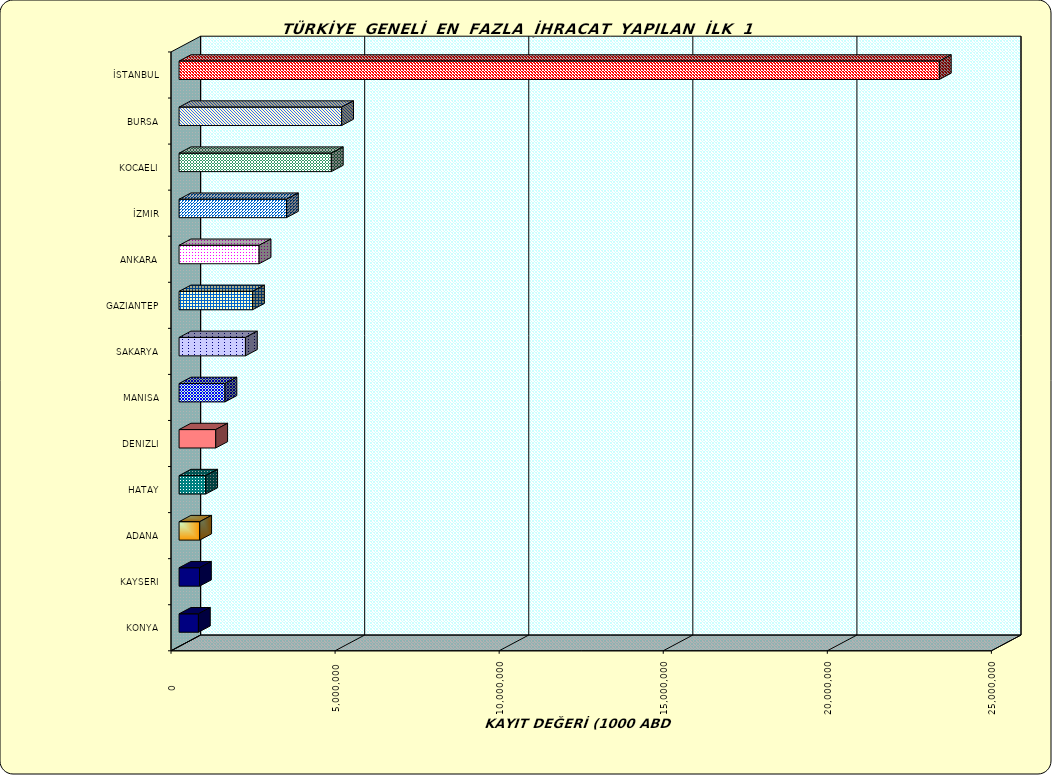
| Category | Series 0 |
|---|---|
| İSTANBUL | 23168135.897 |
| BURSA | 4953978.629 |
| KOCAELI | 4640013.752 |
| İZMIR | 3272809.37 |
| ANKARA | 2439005.863 |
| GAZIANTEP | 2238660.662 |
| SAKARYA | 2022292.429 |
| MANISA | 1398343.611 |
| DENIZLI | 1117135.742 |
| HATAY | 811735.498 |
| ADANA | 629122.014 |
| KAYSERI | 622514.611 |
| KONYA | 589009.531 |